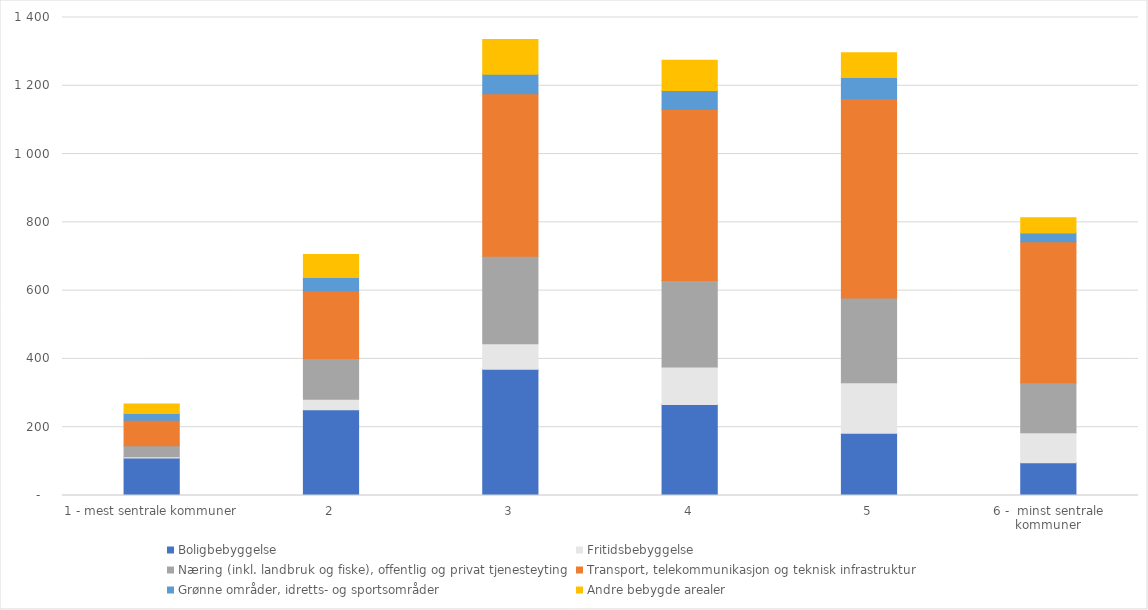
| Category | Boligbebyggelse | Fritidsbebyggelse | Næring (inkl. landbruk og fiske), offentlig og privat tjenesteyting | Transport, telekommunikasjon og teknisk infrastruktur | Grønne områder, idretts- og sportsområder | Andre bebygde arealer |
|---|---|---|---|---|---|---|
| 1 - mest sentrale kommuner | 110.19 | 3.27 | 31.89 | 74.81 | 20.17 | 27.34 |
| 2 | 251.07 | 30.49 | 119.76 | 197.91 | 39.04 | 67.49 |
| 3 | 369.93 | 74.54 | 256.37 | 475.85 | 56.94 | 101.58 |
| 4 | 266.39 | 109.84 | 253.51 | 501.74 | 54.91 | 88.65 |
| 5 | 182.67 | 147.83 | 247.85 | 584.24 | 61.98 | 72.2 |
| 6 -  minst sentrale kommuner | 96.11 | 87.77 | 146.71 | 412.43 | 26.1 | 44.18 |